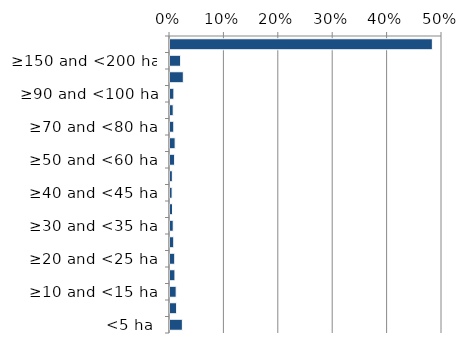
| Category | Non native |
|---|---|
| <5 ha | 0.023 |
| ≥5 and <10 ha | 0.012 |
| ≥10 and <15 ha | 0.011 |
| ≥15 and <20 ha | 0.009 |
| ≥20 and <25 ha | 0.009 |
| ≥25 and <30 ha | 0.007 |
| ≥30 and <35 ha | 0.006 |
| ≥35 and <40 ha | 0.005 |
| ≥40 and <45 ha | 0.004 |
| ≥45 and <50 ha | 0.004 |
| ≥50 and <60 ha | 0.009 |
| ≥60 and <70 ha | 0.009 |
| ≥70 and <80 ha | 0.007 |
| ≥80 and <90 ha | 0.006 |
| ≥90 and <100 ha | 0.007 |
| ≥100 and <150 ha | 0.024 |
| ≥150 and <200 ha | 0.02 |
| ≥200 ha | 0.482 |